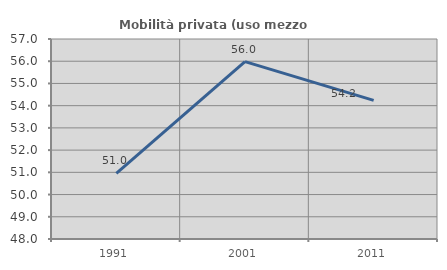
| Category | Mobilità privata (uso mezzo privato) |
|---|---|
| 1991.0 | 50.957 |
| 2001.0 | 55.983 |
| 2011.0 | 54.237 |